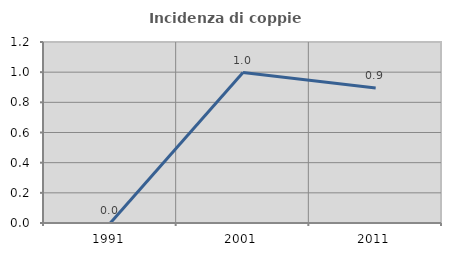
| Category | Incidenza di coppie miste |
|---|---|
| 1991.0 | 0 |
| 2001.0 | 0.998 |
| 2011.0 | 0.895 |